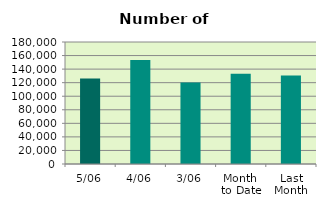
| Category | Series 0 |
|---|---|
| 5/06 | 126014 |
| 4/06 | 153296 |
| 3/06 | 120294 |
| Month 
to Date | 133201.333 |
| Last
Month | 130647.636 |